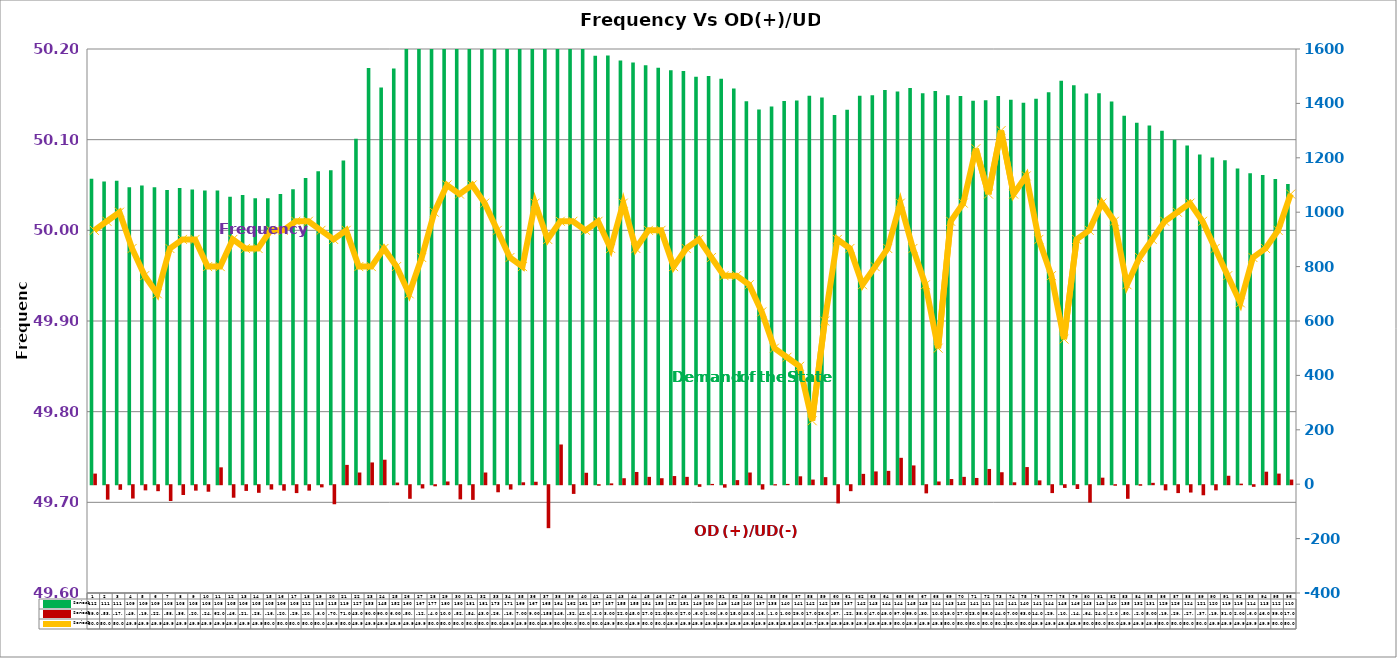
| Category | Series 2 | Series 4 |
|---|---|---|
| 0 | 1123 | 39 |
| 1 | 1113 | -53 |
| 2 | 1116 | -17 |
| 3 | 1092 | -49 |
| 4 | 1098 | -19 |
| 5 | 1092 | -22 |
| 6 | 1082 | -58 |
| 7 | 1089 | -36 |
| 8 | 1083 | -20 |
| 9 | 1080 | -24 |
| 10 | 1080 | 62 |
| 11 | 1057 | -46 |
| 12 | 1063 | -21 |
| 13 | 1051 | -28 |
| 14 | 1051 | -16 |
| 15 | 1067 | -20 |
| 16 | 1084 | -29 |
| 17 | 1126 | -20 |
| 18 | 1151 | -8 |
| 19 | 1154 | -70 |
| 20 | 1190 | 71 |
| 21 | 1270 | 43 |
| 22 | 1530 | 80 |
| 23 | 1458 | 90 |
| 24 | 1528 | 6 |
| 25 | 1609 | -50 |
| 26 | 1673 | -12 |
| 27 | 1776 | -4 |
| 28 | 1805 | 10 |
| 29 | 1801 | -52 |
| 30 | 1812 | -54 |
| 31 | 1819 | 43 |
| 32 | 1730 | -26 |
| 33 | 1713 | -16 |
| 34 | 1691 | 7 |
| 35 | 1678 | 9 |
| 36 | 1658 | -158 |
| 37 | 1645 | 146 |
| 38 | 1628 | -32 |
| 39 | 1610 | 42 |
| 40 | 1575 | -2 |
| 41 | 1576 | 3 |
| 42 | 1558 | 22 |
| 43 | 1550 | 45 |
| 44 | 1540 | 27 |
| 45 | 1531 | 22 |
| 46 | 1522 | 30 |
| 47 | 1519 | 27 |
| 48 | 1498 | -6 |
| 49 | 1501 | 1 |
| 50 | 1491 | -9 |
| 51 | 1455 | 15 |
| 52 | 1408 | 43 |
| 53 | 1378 | -16 |
| 54 | 1389 | -1 |
| 55 | 1409 | 1 |
| 56 | 1411 | 29 |
| 57 | 1428 | 17 |
| 58 | 1422 | 26 |
| 59 | 1357 | -67 |
| 60 | 1377 | -22 |
| 61 | 1428 | 38 |
| 62 | 1430 | 47 |
| 63 | 1449 | 49 |
| 64 | 1444 | 97 |
| 65 | 1457 | 69 |
| 66 | 1437 | -30 |
| 67 | 1446 | 10 |
| 68 | 1430 | 19 |
| 69 | 1427 | 27 |
| 70 | 1410 | 23 |
| 71 | 1412 | 56 |
| 72 | 1427 | 44 |
| 73 | 1413 | 7 |
| 74 | 1402 | 63 |
| 75 | 1417 | 14 |
| 76 | 1441 | -29 |
| 77 | 1483 | -10 |
| 78 | 1467 | -14 |
| 79 | 1436 | -64 |
| 80 | 1437 | 24 |
| 81 | 1407 | -2 |
| 82 | 1355 | -50 |
| 83 | 1329 | -2 |
| 84 | 1319 | 5 |
| 85 | 1299 | -19 |
| 86 | 1266 | -29 |
| 87 | 1245 | -27 |
| 88 | 1212 | -37 |
| 89 | 1201 | -19 |
| 90 | 1191 | 31 |
| 91 | 1161 | 2 |
| 92 | 1143 | -6 |
| 93 | 1137 | 46 |
| 94 | 1122 | 39 |
| 95 | 1104 | 17 |